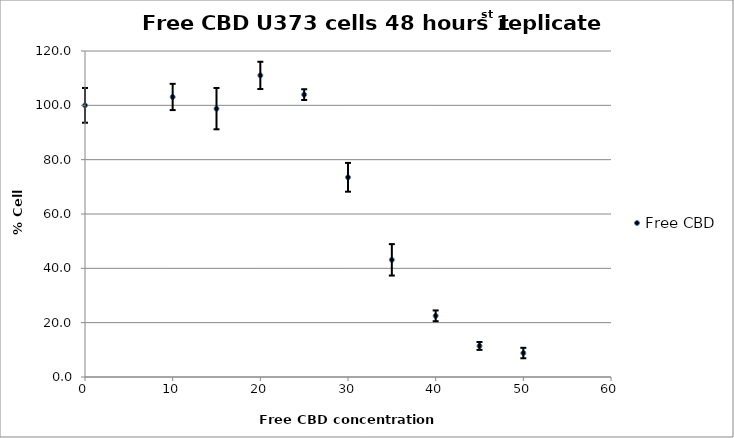
| Category | Free CBD |
|---|---|
| 50.0 | 8.818 |
| 45.0 | 11.43 |
| 40.0 | 22.519 |
| 35.0 | 43.129 |
| 30.0 | 73.509 |
| 25.0 | 103.939 |
| 20.0 | 111.017 |
| 15.0 | 98.78 |
| 10.0 | 103.082 |
| 0.0 | 100 |